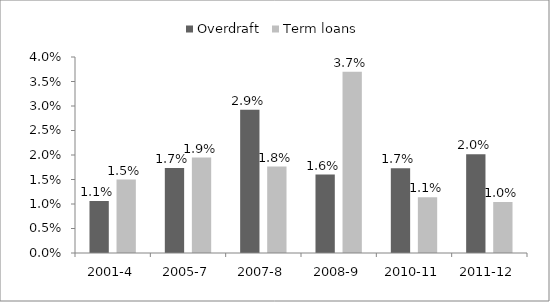
| Category | Overdraft | Term loans |
|---|---|---|
| 2001-4 | 0.011 | 0.015 |
| 2005-7 | 0.017 | 0.019 |
| 2007-8 | 0.029 | 0.018 |
| 2008-9 | 0.016 | 0.037 |
| 2010-11 | 0.017 | 0.011 |
| 2011-12 | 0.02 | 0.01 |